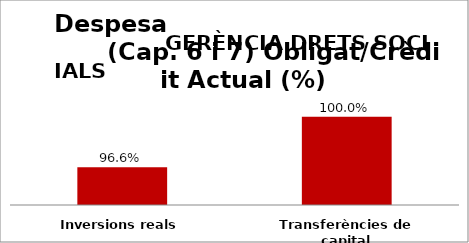
| Category | Series 0 |
|---|---|
| Inversions reals | 0.966 |
| Transferències de capital | 1 |